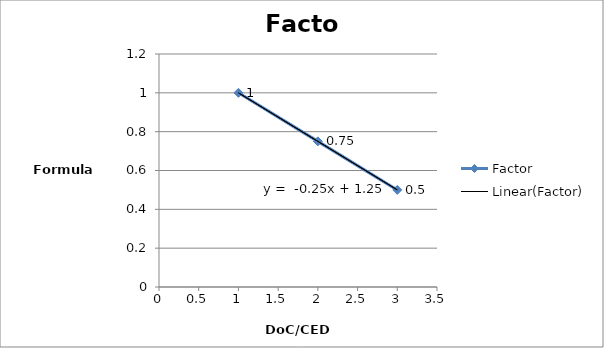
| Category | Factor |
|---|---|
| 1.0 | 1 |
| 2.0 | 0.75 |
| 3.0 | 0.5 |